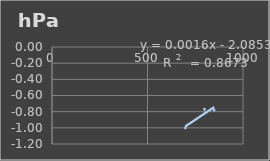
| Category | Presión Atmosférica |
|---|---|
| 698.2 | -1 |
| 798.4 | -0.77 |
| 848.7 | -0.78 |